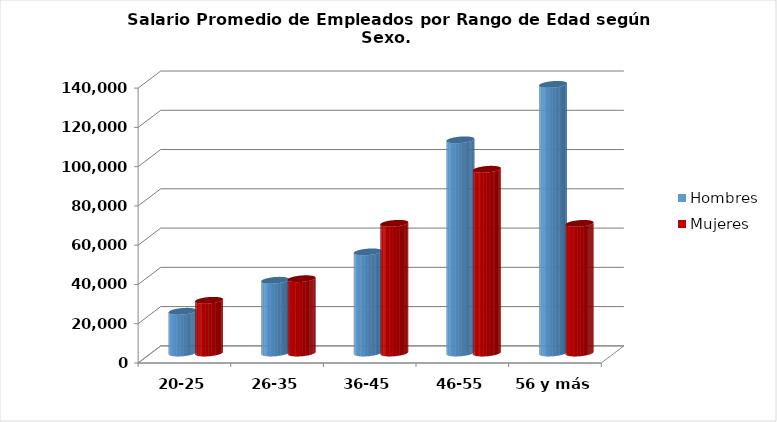
| Category | Hombres | Mujeres |
|---|---|---|
| 20-25 | 21247 | 26830 |
| 26-35 | 37034.346 | 37827.543 |
| 36-45 | 51500.026 | 66035.821 |
| 46-55 | 108568.018 | 93579.129 |
| 56 y más | 136823.082 | 66004.917 |